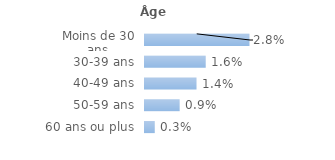
| Category | Series 0 |
|---|---|
| Moins de 30 ans | 0.028 |
| 30-39 ans | 0.016 |
| 40-49 ans | 0.014 |
| 50-59 ans | 0.009 |
| 60 ans ou plus | 0.003 |